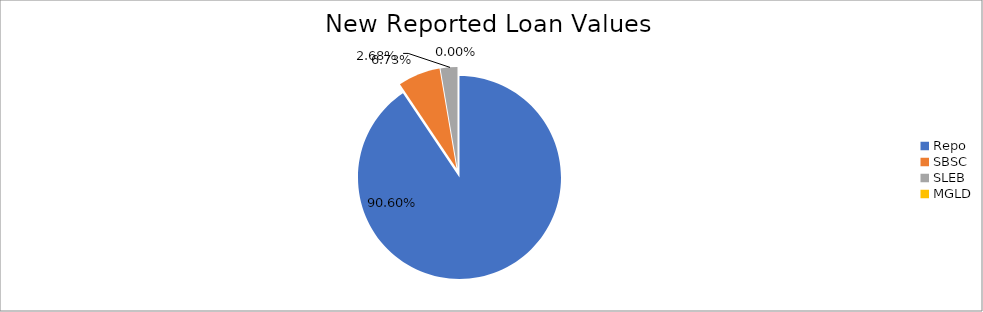
| Category | Series 0 |
|---|---|
| Repo | 12362754.808 |
| SBSC | 917782.419 |
| SLEB | 365439.817 |
| MGLD | 143.981 |